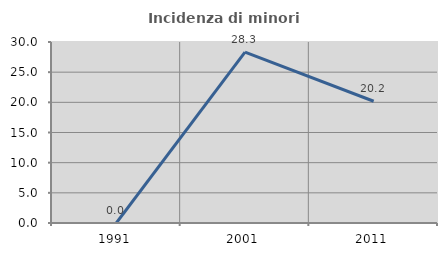
| Category | Incidenza di minori stranieri |
|---|---|
| 1991.0 | 0 |
| 2001.0 | 28.333 |
| 2011.0 | 20.175 |